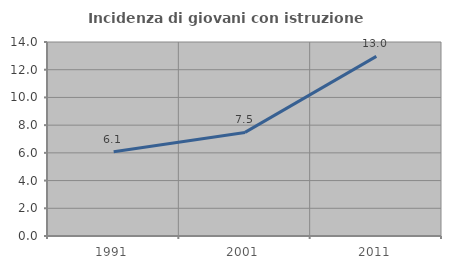
| Category | Incidenza di giovani con istruzione universitaria |
|---|---|
| 1991.0 | 6.087 |
| 2001.0 | 7.477 |
| 2011.0 | 12.963 |